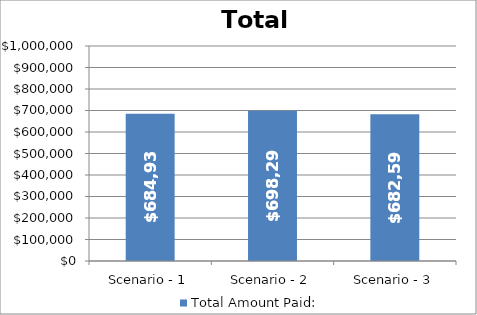
| Category | Total Amount Paid: |
|---|---|
| Scenario - 1 | 684938.127 |
| Scenario - 2 | 698295.205 |
| Scenario - 3 | 682592.108 |